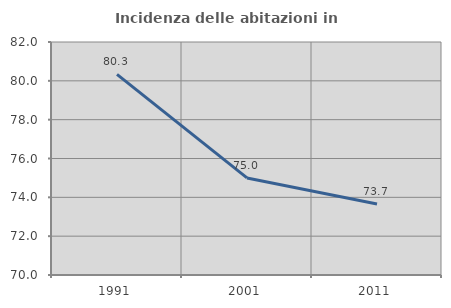
| Category | Incidenza delle abitazioni in proprietà  |
|---|---|
| 1991.0 | 80.335 |
| 2001.0 | 75 |
| 2011.0 | 73.656 |